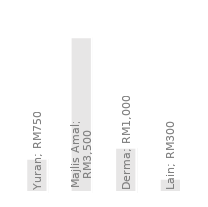
| Category | Hasil Tahunan |
|---|---|
| Yuran | 750 |
| Majlis Amal | 3500 |
| Derma | 1000 |
| Lain | 300 |